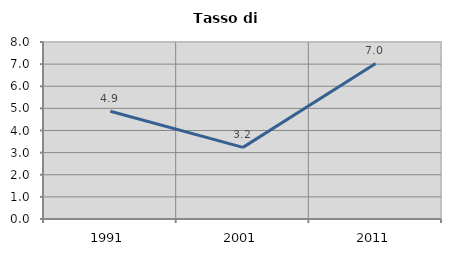
| Category | Tasso di disoccupazione   |
|---|---|
| 1991.0 | 4.872 |
| 2001.0 | 3.237 |
| 2011.0 | 7.03 |